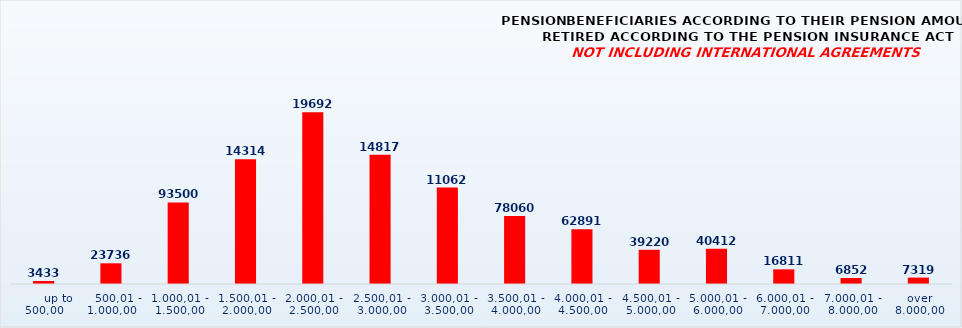
| Category | PENSION BENEFICIARIES ACCORDING TO TYPES AND AMOUNTS OF PENSION, RETIRED ACCORDING TO THE PENSION INSURANCE ACT
NOT INCLUDING INTERNATIONAL AGREEMENTS |
|---|---|
|       up to 500,00 | 3433 |
|    500,01 - 1.000,00 | 23736 |
| 1.000,01 - 1.500,00 | 93500 |
| 1.500,01 - 2.000,00 | 143142 |
| 2.000,01 - 2.500,00 | 196923 |
| 2.500,01 - 3.000,00 | 148171 |
| 3.000,01 - 3.500,00 | 110621 |
| 3.500,01 - 4.000,00 | 78060 |
| 4.000,01 - 4.500,00 | 62891 |
| 4.500,01 - 5.000,00 | 39220 |
| 5.000,01 - 6.000,00 | 40412 |
| 6.000,01 - 7.000,00 | 16811 |
| 7.000,01 - 8.000,00 | 6852 |
|  over  8.000,00 | 7319 |